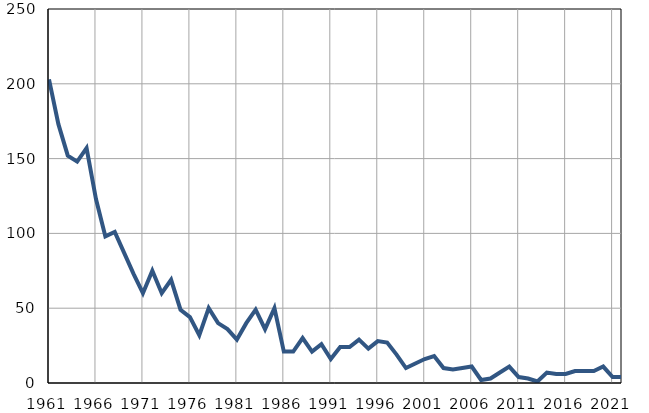
| Category | Умрла 
одојчад |
|---|---|
| 1961.0 | 203 |
| 1962.0 | 173 |
| 1963.0 | 152 |
| 1964.0 | 148 |
| 1965.0 | 157 |
| 1966.0 | 123 |
| 1967.0 | 98 |
| 1968.0 | 101 |
| 1969.0 | 87 |
| 1970.0 | 73 |
| 1971.0 | 60 |
| 1972.0 | 75 |
| 1973.0 | 60 |
| 1974.0 | 69 |
| 1975.0 | 49 |
| 1976.0 | 44 |
| 1977.0 | 32 |
| 1978.0 | 50 |
| 1979.0 | 40 |
| 1980.0 | 36 |
| 1981.0 | 29 |
| 1982.0 | 40 |
| 1983.0 | 49 |
| 1984.0 | 36 |
| 1985.0 | 50 |
| 1986.0 | 21 |
| 1987.0 | 21 |
| 1988.0 | 30 |
| 1989.0 | 21 |
| 1990.0 | 26 |
| 1991.0 | 16 |
| 1992.0 | 24 |
| 1993.0 | 24 |
| 1994.0 | 29 |
| 1995.0 | 23 |
| 1996.0 | 28 |
| 1997.0 | 27 |
| 1998.0 | 19 |
| 1999.0 | 10 |
| 2000.0 | 13 |
| 2001.0 | 16 |
| 2002.0 | 18 |
| 2003.0 | 10 |
| 2004.0 | 9 |
| 2005.0 | 10 |
| 2006.0 | 11 |
| 2007.0 | 2 |
| 2008.0 | 3 |
| 2009.0 | 7 |
| 2010.0 | 11 |
| 2011.0 | 4 |
| 2012.0 | 3 |
| 2013.0 | 1 |
| 2014.0 | 7 |
| 2015.0 | 6 |
| 2016.0 | 6 |
| 2017.0 | 8 |
| 2018.0 | 8 |
| 2019.0 | 8 |
| 2020.0 | 11 |
| 2021.0 | 4 |
| 2022.0 | 4 |